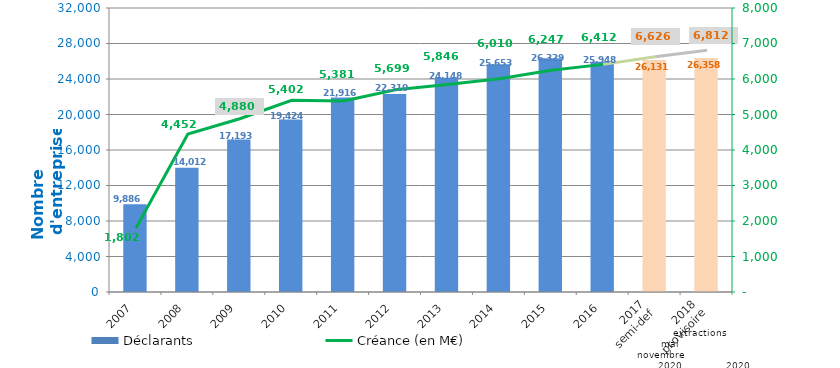
| Category | Déclarants |
|---|---|
| 2007 | 9886 |
| 2008 | 14012 |
| 2009 | 17193 |
| 2010 | 19424 |
| 2011 | 21916 |
| 2012 | 22310 |
| 2013 | 24148 |
| 2014 | 25653 |
| 2015 | 26329 |
| 2016 | 25948 |
| 2017
semi-def | 26131 |
| 2018
provisoire | 26358 |